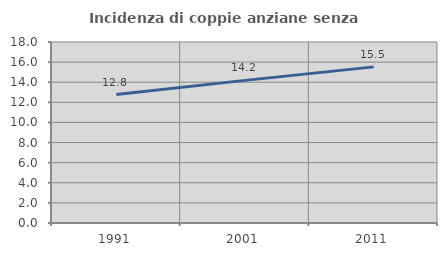
| Category | Incidenza di coppie anziane senza figli  |
|---|---|
| 1991.0 | 12.769 |
| 2001.0 | 14.183 |
| 2011.0 | 15.526 |